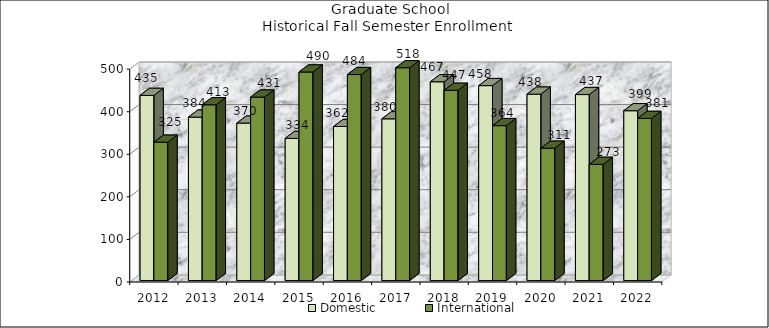
| Category | Domestic | International |
|---|---|---|
| 2012.0 | 435 | 325 |
| 2013.0 | 384 | 413 |
| 2014.0 | 370 | 431 |
| 2015.0 | 334 | 490 |
| 2016.0 | 362 | 484 |
| 2017.0 | 380 | 518 |
| 2018.0 | 467 | 447 |
| 2019.0 | 458 | 364 |
| 2020.0 | 438 | 311 |
| 2021.0 | 437 | 273 |
| 2022.0 | 399 | 381 |